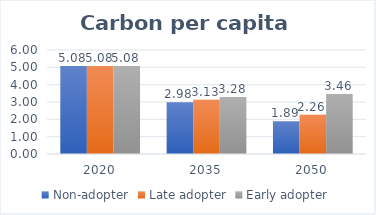
| Category | Non-adopter | Late adopter | Early adopter |
|---|---|---|---|
| 2020.0 | 5.077 | 5.077 | 5.077 |
| 2035.0 | 2.983 | 3.133 | 3.283 |
| 2050.0 | 1.89 | 2.261 | 3.461 |